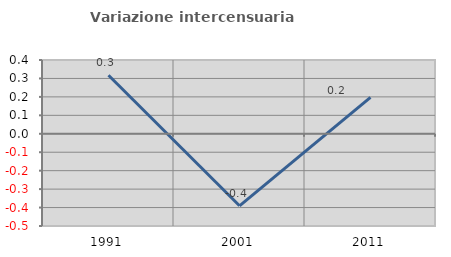
| Category | Variazione intercensuaria annua |
|---|---|
| 1991.0 | 0.317 |
| 2001.0 | -0.39 |
| 2011.0 | 0.198 |